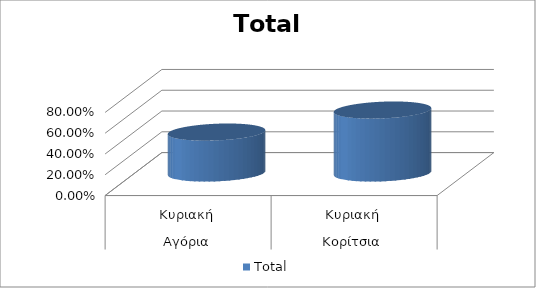
| Category | Total |
|---|---|
| 0 | 0.394 |
| 1 | 0.606 |